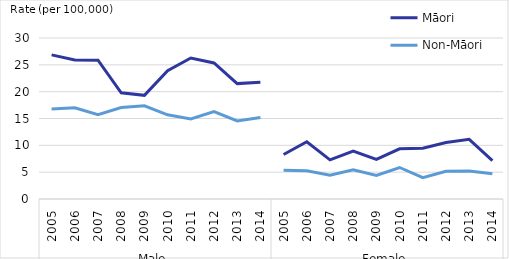
| Category | Māori | Non-Māori |
|---|---|---|
| 0 | 26.851 | 16.757 |
| 1 | 25.898 | 16.987 |
| 2 | 25.874 | 15.733 |
| 3 | 19.797 | 17.038 |
| 4 | 19.312 | 17.374 |
| 5 | 23.898 | 15.69 |
| 6 | 26.277 | 14.9 |
| 7 | 25.349 | 16.274 |
| 8 | 21.502 | 14.538 |
| 9 | 21.738 | 15.2 |
| 10 | 8.282 | 5.354 |
| 11 | 10.67 | 5.258 |
| 12 | 7.284 | 4.425 |
| 13 | 8.945 | 5.436 |
| 14 | 7.377 | 4.374 |
| 15 | 9.359 | 5.872 |
| 16 | 9.47 | 3.976 |
| 17 | 10.53 | 5.161 |
| 18 | 11.121 | 5.205 |
| 19 | 7.158 | 4.7 |